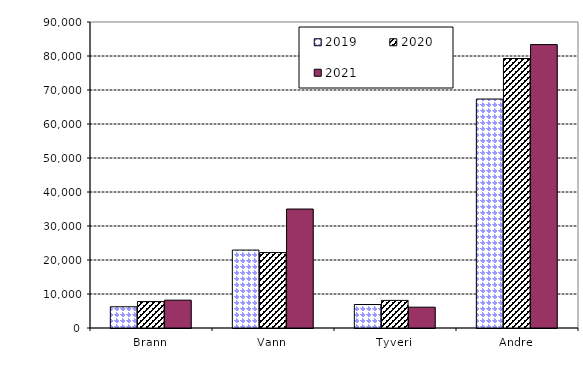
| Category | 2019 | 2020 | 2021 |
|---|---|---|---|
| Brann | 6246.066 | 7767.288 | 8185.241 |
| Vann | 22919.925 | 22180.309 | 34994.274 |
| Tyveri | 6910.102 | 8117.27 | 6121.597 |
| Andre | 67340.428 | 79263.819 | 83362.542 |